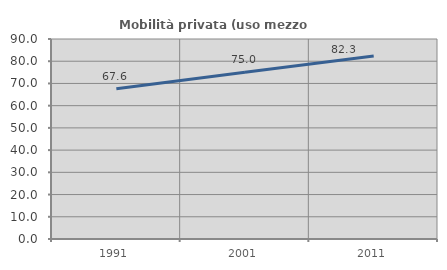
| Category | Mobilità privata (uso mezzo privato) |
|---|---|
| 1991.0 | 67.613 |
| 2001.0 | 75.031 |
| 2011.0 | 82.301 |